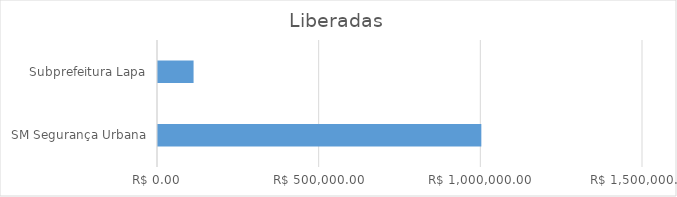
| Category | Series 0 |
|---|---|
| SM Segurança Urbana | 1000000 |
| Subprefeitura Lapa | 110000 |